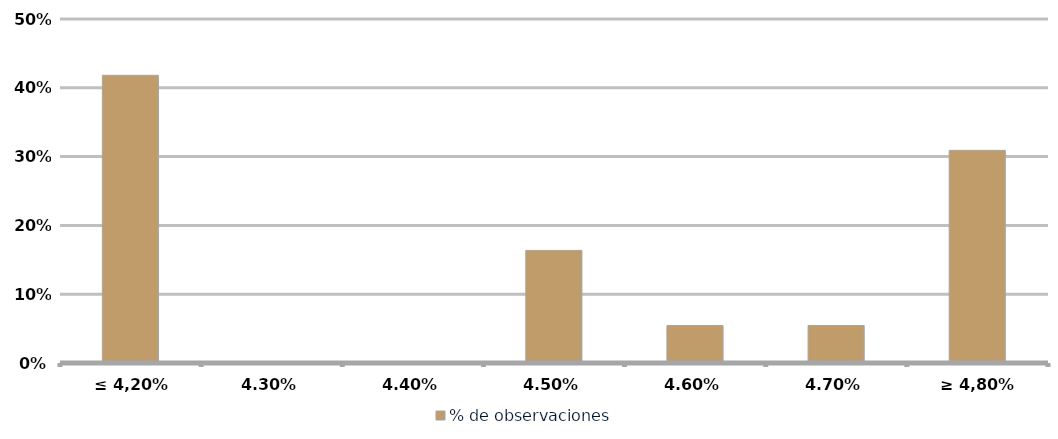
| Category | % de observaciones  |
|---|---|
| ≤ 4,20% | 0.418 |
| 4,30% | 0 |
| 4,40% | 0 |
| 4,50% | 0.164 |
| 4,60% | 0.055 |
| 4,70% | 0.055 |
| ≥ 4,80% | 0.309 |